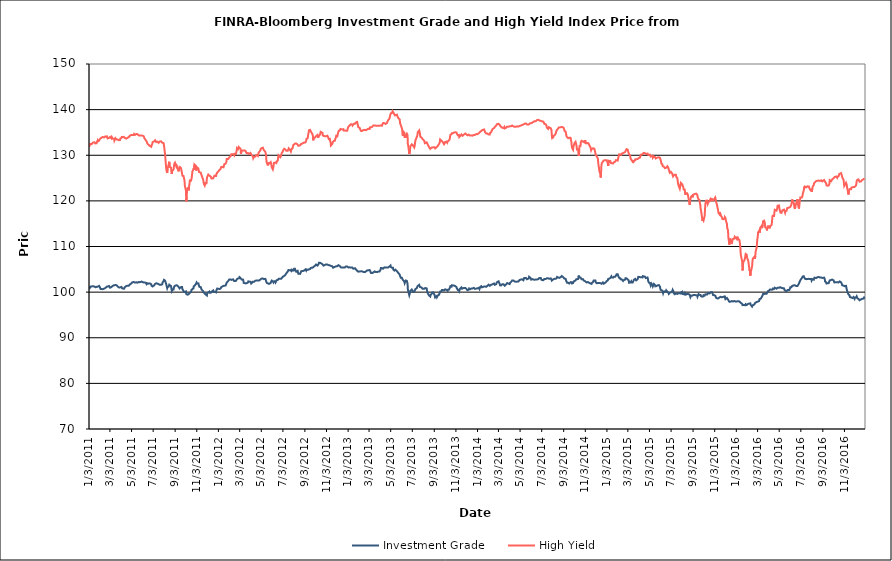
| Category | Investment Grade | High Yield |
|---|---|---|
| 1/3/11 | 101.208 | 131.858 |
| 1/4/11 | 101.316 | 132.091 |
| 1/5/11 | 100.937 | 132.302 |
| 1/6/11 | 100.955 | 132.482 |
| 1/7/11 | 101.214 | 132.404 |
| 1/10/11 | 101.247 | 132.434 |
| 1/11/11 | 101.24 | 132.58 |
| 1/12/11 | 101.18 | 132.636 |
| 1/13/11 | 101.307 | 132.753 |
| 1/14/11 | 101.392 | 132.788 |
| 1/18/11 | 101.21 | 132.849 |
| 1/19/11 | 101.349 | 132.835 |
| 1/20/11 | 101.094 | 132.594 |
| 1/21/11 | 101.074 | 132.574 |
| 1/24/11 | 101.163 | 132.632 |
| 1/25/11 | 101.328 | 132.944 |
| 1/26/11 | 101.147 | 133.021 |
| 1/27/11 | 101.186 | 133.283 |
| 1/28/11 | 101.332 | 133.054 |
| 1/31/11 | 101.371 | 133.197 |
| 2/1/11 | 101.177 | 133.376 |
| 2/2/11 | 101.113 | 133.508 |
| 2/3/11 | 100.901 | 133.416 |
| 2/4/11 | 100.688 | 133.653 |
| 2/7/11 | 100.708 | 133.883 |
| 2/8/11 | 100.678 | 134.026 |
| 2/9/11 | 100.64 | 134.065 |
| 2/10/11 | 100.635 | 134.006 |
| 2/11/11 | 100.689 | 133.906 |
| 2/14/11 | 100.76 | 133.89 |
| 2/15/11 | 100.792 | 133.913 |
| 2/16/11 | 100.816 | 134.016 |
| 2/17/11 | 100.877 | 134.107 |
| 2/18/11 | 100.849 | 134.178 |
| 2/22/11 | 101.209 | 134.145 |
| 2/23/11 | 101.204 | 133.96 |
| 2/24/11 | 101.068 | 133.689 |
| 2/25/11 | 101.217 | 133.737 |
| 2/28/11 | 101.347 | 133.797 |
| 3/1/11 | 101.398 | 133.935 |
| 3/2/11 | 101.379 | 133.992 |
| 3/3/11 | 100.969 | 134.003 |
| 3/4/11 | 101.076 | 133.893 |
| 3/7/11 | 101.137 | 133.668 |
| 3/8/11 | 101.019 | 133.964 |
| 3/9/11 | 101.172 | 133.956 |
| 3/10/11 | 101.344 | 133.656 |
| 3/11/11 | 101.44 | 133.576 |
| 3/14/11 | 101.514 | 133.638 |
| 3/15/11 | 101.535 | 133.214 |
| 3/16/11 | 101.719 | 133.178 |
| 3/17/11 | 101.535 | 133.421 |
| 3/18/11 | 101.606 | 133.749 |
| 3/21/11 | 101.533 | 133.484 |
| 3/22/11 | 101.512 | 133.544 |
| 3/23/11 | 101.421 | 133.408 |
| 3/24/11 | 101.267 | 133.44 |
| 3/25/11 | 101.138 | 133.353 |
| 3/28/11 | 101.016 | 133.284 |
| 3/29/11 | 100.882 | 133.292 |
| 3/30/11 | 100.871 | 133.463 |
| 3/31/11 | 101.038 | 133.352 |
| 4/1/11 | 100.887 | 133.702 |
| 4/4/11 | 101.136 | 133.797 |
| 4/5/11 | 100.963 | 134.02 |
| 4/6/11 | 100.836 | 133.92 |
| 4/7/11 | 100.781 | 133.902 |
| 4/8/11 | 100.76 | 134.004 |
| 4/11/11 | 100.727 | 134.028 |
| 4/12/11 | 100.924 | 133.848 |
| 4/13/11 | 101.032 | 133.808 |
| 4/14/11 | 101.001 | 133.714 |
| 4/15/11 | 101.239 | 133.871 |
| 4/18/11 | 101.36 | 133.65 |
| 4/19/11 | 101.451 | 133.651 |
| 4/20/11 | 101.424 | 133.737 |
| 4/21/11 | 101.387 | 133.825 |
| 4/25/11 | 101.419 | 133.988 |
| 4/26/11 | 101.611 | 134.092 |
| 4/27/11 | 101.48 | 134.04 |
| 4/28/11 | 101.708 | 134.311 |
| 4/29/11 | 101.828 | 134.333 |
| 5/2/11 | 101.906 | 134.443 |
| 5/3/11 | 101.997 | 134.32 |
| 5/4/11 | 102.075 | 134.479 |
| 5/5/11 | 102.171 | 134.418 |
| 5/6/11 | 102.158 | 134.578 |
| 5/9/11 | 102.209 | 134.425 |
| 5/10/11 | 102.082 | 134.688 |
| 5/11/11 | 102.109 | 134.7 |
| 5/12/11 | 102.099 | 134.527 |
| 5/13/11 | 102.138 | 134.491 |
| 5/16/11 | 102.149 | 134.632 |
| 5/17/11 | 102.353 | 134.587 |
| 5/18/11 | 102.212 | 134.566 |
| 5/19/11 | 102.07 | 134.636 |
| 5/20/11 | 102.132 | 134.542 |
| 5/23/11 | 102.226 | 134.352 |
| 5/24/11 | 102.138 | 134.411 |
| 5/25/11 | 102.088 | 134.326 |
| 5/26/11 | 102.164 | 134.342 |
| 5/27/11 | 102.195 | 134.51 |
| 5/31/11 | 102.313 | 134.338 |
| 6/1/11 | 102.499 | 134.385 |
| 6/2/11 | 102.253 | 134.221 |
| 6/3/11 | 102.189 | 134.283 |
| 6/6/11 | 102.12 | 134.159 |
| 6/7/11 | 102.072 | 133.967 |
| 6/8/11 | 102.173 | 133.704 |
| 6/9/11 | 102.106 | 133.568 |
| 6/10/11 | 102.076 | 133.506 |
| 6/13/11 | 102.012 | 133.153 |
| 6/14/11 | 101.73 | 133.037 |
| 6/15/11 | 101.868 | 132.872 |
| 6/16/11 | 101.948 | 132.554 |
| 6/17/11 | 101.926 | 132.653 |
| 6/20/11 | 101.853 | 132.269 |
| 6/21/11 | 101.876 | 132.267 |
| 6/22/11 | 101.873 | 132.44 |
| 6/23/11 | 101.908 | 132.05 |
| 6/24/11 | 102.002 | 132.113 |
| 6/27/11 | 101.741 | 131.865 |
| 6/28/11 | 101.402 | 132.191 |
| 6/29/11 | 101.26 | 132.363 |
| 6/30/11 | 101.2 | 132.454 |
| 7/1/11 | 101.237 | 132.902 |
| 7/5/11 | 101.449 | 133.029 |
| 7/6/11 | 101.506 | 133.115 |
| 7/7/11 | 101.395 | 133.231 |
| 7/8/11 | 101.8 | 133.28 |
| 7/11/11 | 101.933 | 132.888 |
| 7/12/11 | 102.014 | 132.784 |
| 7/13/11 | 102.042 | 132.957 |
| 7/14/11 | 101.89 | 132.999 |
| 7/15/11 | 101.851 | 132.866 |
| 7/18/11 | 101.732 | 132.724 |
| 7/19/11 | 101.677 | 132.722 |
| 7/20/11 | 101.802 | 132.936 |
| 7/21/11 | 101.598 | 133.028 |
| 7/22/11 | 101.707 | 133.068 |
| 7/25/11 | 101.6 | 133.049 |
| 7/26/11 | 101.668 | 133.246 |
| 7/27/11 | 101.671 | 132.951 |
| 7/28/11 | 101.71 | 132.748 |
| 7/29/11 | 102.101 | 132.541 |
| 8/1/11 | 102.445 | 132.668 |
| 8/2/11 | 102.69 | 132.126 |
| 8/3/11 | 102.765 | 131.582 |
| 8/4/11 | 102.858 | 130.856 |
| 8/5/11 | 102.526 | 130.297 |
| 8/8/11 | 101.818 | 127.319 |
| 8/9/11 | 101.642 | 126.715 |
| 8/10/11 | 101.666 | 126.678 |
| 8/11/11 | 100.881 | 126.106 |
| 8/12/11 | 101.126 | 127.015 |
| 8/15/11 | 101.191 | 127.903 |
| 8/16/11 | 101.405 | 128.042 |
| 8/17/11 | 101.631 | 128.573 |
| 8/18/11 | 101.692 | 127.705 |
| 8/19/11 | 101.529 | 127.395 |
| 8/22/11 | 101.314 | 127.264 |
| 8/23/11 | 100.821 | 126.282 |
| 8/24/11 | 100.273 | 125.927 |
| 8/25/11 | 100.448 | 126.498 |
| 8/26/11 | 100.592 | 126.715 |
| 8/29/11 | 100.573 | 126.885 |
| 8/30/11 | 101.003 | 127.033 |
| 8/31/11 | 101.14 | 128.078 |
| 9/1/11 | 101.324 | 128.205 |
| 9/2/11 | 101.474 | 128.365 |
| 9/6/11 | 101.516 | 127.515 |
| 9/7/11 | 101.486 | 127.765 |
| 9/8/11 | 101.502 | 127.727 |
| 9/9/11 | 101.426 | 127.519 |
| 9/12/11 | 101.178 | 126.474 |
| 9/13/11 | 100.959 | 126.623 |
| 9/14/11 | 100.983 | 127.097 |
| 9/15/11 | 100.799 | 127.314 |
| 9/16/11 | 100.88 | 127.409 |
| 9/19/11 | 101.097 | 127.172 |
| 9/20/11 | 101.095 | 127.29 |
| 9/21/11 | 101.153 | 127.116 |
| 9/22/11 | 101.108 | 125.995 |
| 9/23/11 | 100.647 | 125.52 |
| 9/26/11 | 100.298 | 125.465 |
| 9/27/11 | 100.058 | 125.611 |
| 9/28/11 | 99.924 | 124.851 |
| 9/29/11 | 99.972 | 124.344 |
| 9/30/11 | 99.996 | 123.273 |
| 10/3/11 | 100.148 | 122.236 |
| 10/4/11 | 99.594 | 119.881 |
| 10/5/11 | 99.418 | 120.775 |
| 10/6/11 | 99.443 | 122.277 |
| 10/7/11 | 99.434 | 122.768 |
| 10/10/11 | 99.517 | 122.852 |
| 10/11/11 | 99.353 | 122.3 |
| 10/12/11 | 99.527 | 123.376 |
| 10/13/11 | 99.78 | 123.672 |
| 10/14/11 | 99.81 | 124.466 |
| 10/17/11 | 100.031 | 124.417 |
| 10/18/11 | 100.25 | 124.296 |
| 10/19/11 | 100.53 | 124.939 |
| 10/20/11 | 100.68 | 125.541 |
| 10/21/11 | 100.707 | 126.394 |
| 10/24/11 | 100.807 | 126.914 |
| 10/25/11 | 101.264 | 127.167 |
| 10/26/11 | 101.368 | 126.792 |
| 10/27/11 | 101.348 | 127.975 |
| 10/28/11 | 101.463 | 127.875 |
| 10/31/11 | 101.784 | 127.696 |
| 11/1/11 | 101.959 | 126.648 |
| 11/2/11 | 102.125 | 126.978 |
| 11/3/11 | 102.008 | 127.376 |
| 11/4/11 | 101.874 | 127.162 |
| 11/7/11 | 101.905 | 127.097 |
| 11/8/11 | 101.595 | 127.239 |
| 11/9/11 | 101.39 | 126.322 |
| 11/10/11 | 101.173 | 126.414 |
| 11/11/11 | 101.238 | 126.491 |
| 11/14/11 | 101.069 | 126.17 |
| 11/15/11 | 100.767 | 125.82 |
| 11/16/11 | 100.761 | 125.629 |
| 11/17/11 | 100.469 | 125.434 |
| 11/18/11 | 100.413 | 125.196 |
| 11/21/11 | 100.183 | 124.532 |
| 11/22/11 | 99.951 | 123.879 |
| 11/23/11 | 99.805 | 123.809 |
| 11/25/11 | 99.664 | 123.358 |
| 11/28/11 | 99.47 | 124.094 |
| 11/29/11 | 99.414 | 123.689 |
| 11/30/11 | 99.404 | 124.084 |
| 12/1/11 | 99.27 | 124.86 |
| 12/2/11 | 99.785 | 125.29 |
| 12/5/11 | 99.93 | 125.775 |
| 12/6/11 | 99.982 | 125.795 |
| 12/7/11 | 99.949 | 125.612 |
| 12/8/11 | 100.115 | 125.538 |
| 12/9/11 | 99.872 | 125.454 |
| 12/12/11 | 99.867 | 125.317 |
| 12/13/11 | 99.906 | 125.158 |
| 12/14/11 | 100 | 124.913 |
| 12/15/11 | 100.134 | 124.961 |
| 12/16/11 | 100.313 | 125.058 |
| 12/19/11 | 100.375 | 124.938 |
| 12/20/11 | 100.196 | 125.175 |
| 12/21/11 | 100.097 | 125.223 |
| 12/22/11 | 100.134 | 125.503 |
| 12/23/11 | 100.016 | 125.63 |
| 12/27/11 | 99.947 | 125.464 |
| 12/28/11 | 100.421 | 125.864 |
| 12/29/11 | 100.555 | 126.044 |
| 12/30/11 | 100.774 | 126.162 |
| 1/3/12 | 100.742 | 126.521 |
| 1/4/12 | 100.597 | 126.529 |
| 1/5/12 | 100.548 | 126.663 |
| 1/6/12 | 100.672 | 126.824 |
| 1/9/12 | 100.818 | 127.016 |
| 1/10/12 | 100.91 | 127.393 |
| 1/11/12 | 101.119 | 127.414 |
| 1/12/12 | 101.246 | 127.571 |
| 1/13/12 | 101.324 | 127.463 |
| 1/17/12 | 101.365 | 127.36 |
| 1/18/12 | 101.455 | 127.435 |
| 1/19/12 | 101.448 | 128.026 |
| 1/20/12 | 101.421 | 128.07 |
| 1/23/12 | 101.433 | 128.175 |
| 1/24/12 | 101.349 | 128.221 |
| 1/25/12 | 101.65 | 128.487 |
| 1/26/12 | 102.102 | 129.167 |
| 1/27/12 | 102.266 | 129.213 |
| 1/30/12 | 102.431 | 129.164 |
| 1/31/12 | 102.58 | 129.039 |
| 2/1/12 | 102.574 | 129.405 |
| 2/2/12 | 102.767 | 129.511 |
| 2/3/12 | 102.65 | 129.574 |
| 2/6/12 | 102.774 | 129.798 |
| 2/7/12 | 102.668 | 129.809 |
| 2/8/12 | 102.826 | 130.217 |
| 2/9/12 | 102.679 | 130.377 |
| 2/10/12 | 102.743 | 130.002 |
| 2/13/12 | 102.811 | 130.239 |
| 2/14/12 | 102.821 | 130.083 |
| 2/15/12 | 102.83 | 130.106 |
| 2/16/12 | 102.429 | 129.967 |
| 2/17/12 | 102.479 | 130.307 |
| 2/21/12 | 102.463 | 130.284 |
| 2/22/12 | 102.57 | 130.67 |
| 2/23/12 | 102.664 | 130.956 |
| 2/24/12 | 102.855 | 131.597 |
| 2/27/12 | 103.004 | 131.368 |
| 2/28/12 | 103.144 | 131.529 |
| 2/29/12 | 103.205 | 131.808 |
| 3/1/12 | 103.025 | 131.852 |
| 3/2/12 | 103.284 | 131.736 |
| 3/5/12 | 103.056 | 131.389 |
| 3/6/12 | 102.929 | 130.339 |
| 3/7/12 | 102.889 | 130.576 |
| 3/8/12 | 102.775 | 130.669 |
| 3/9/12 | 102.69 | 131.049 |
| 3/12/12 | 102.756 | 131.049 |
| 3/13/12 | 102.485 | 131.146 |
| 3/14/12 | 102.022 | 131.244 |
| 3/15/12 | 101.978 | 131.069 |
| 3/16/12 | 102.017 | 131.099 |
| 3/19/12 | 101.918 | 130.958 |
| 3/20/12 | 101.786 | 130.727 |
| 3/21/12 | 102.027 | 130.902 |
| 3/22/12 | 101.958 | 130.559 |
| 3/23/12 | 102.123 | 130.411 |
| 3/26/12 | 102.121 | 130.481 |
| 3/27/12 | 102.364 | 130.583 |
| 3/28/12 | 102.343 | 130.551 |
| 3/29/12 | 102.348 | 130.289 |
| 3/30/12 | 102.304 | 130.504 |
| 4/2/12 | 102.275 | 130.507 |
| 4/3/12 | 102.178 | 130.54 |
| 4/4/12 | 101.896 | 130.313 |
| 4/5/12 | 101.959 | 130.066 |
| 4/9/12 | 102.29 | 129.724 |
| 4/10/12 | 102.336 | 129.341 |
| 4/11/12 | 102.227 | 129.316 |
| 4/12/12 | 102.258 | 129.646 |
| 4/13/12 | 102.438 | 129.816 |
| 4/16/12 | 102.512 | 129.715 |
| 4/17/12 | 102.447 | 129.998 |
| 4/18/12 | 102.478 | 130.062 |
| 4/19/12 | 102.542 | 130 |
| 4/20/12 | 102.456 | 130.072 |
| 4/23/12 | 102.528 | 129.844 |
| 4/24/12 | 102.45 | 130.122 |
| 4/25/12 | 102.376 | 130.54 |
| 4/26/12 | 102.526 | 130.61 |
| 4/27/12 | 102.624 | 130.774 |
| 4/30/12 | 102.764 | 131.097 |
| 5/1/12 | 102.747 | 131.422 |
| 5/2/12 | 102.891 | 131.549 |
| 5/3/12 | 102.958 | 131.559 |
| 5/4/12 | 103.036 | 131.564 |
| 5/7/12 | 102.967 | 131.646 |
| 5/8/12 | 103.069 | 131.43 |
| 5/9/12 | 102.922 | 131.22 |
| 5/10/12 | 102.853 | 131.368 |
| 5/11/12 | 102.937 | 131.343 |
| 5/14/12 | 102.896 | 130.719 |
| 5/15/12 | 102.777 | 130.618 |
| 5/16/12 | 102.436 | 130.036 |
| 5/17/12 | 102.22 | 128.787 |
| 5/18/12 | 102.02 | 128.397 |
| 5/21/12 | 101.935 | 127.807 |
| 5/22/12 | 101.836 | 128.404 |
| 5/23/12 | 101.909 | 128.029 |
| 5/24/12 | 101.806 | 128.076 |
| 5/25/12 | 101.934 | 128.245 |
| 5/29/12 | 102 | 128.512 |
| 5/30/12 | 102.241 | 128.252 |
| 5/31/12 | 102.454 | 128.088 |
| 6/1/12 | 102.529 | 127.354 |
| 6/4/12 | 102.342 | 126.898 |
| 6/5/12 | 102.151 | 126.694 |
| 6/6/12 | 102.104 | 127.566 |
| 6/7/12 | 102.302 | 128.314 |
| 6/8/12 | 102.404 | 128.144 |
| 6/11/12 | 102.405 | 128.406 |
| 6/12/12 | 102.158 | 128.202 |
| 6/13/12 | 102.242 | 128.297 |
| 6/14/12 | 102.219 | 128.278 |
| 6/15/12 | 102.624 | 128.671 |
| 6/18/12 | 102.678 | 128.831 |
| 6/19/12 | 102.678 | 129.471 |
| 6/20/12 | 102.731 | 129.982 |
| 6/21/12 | 102.928 | 130.01 |
| 6/22/12 | 102.86 | 129.877 |
| 6/25/12 | 102.926 | 129.569 |
| 6/26/12 | 102.827 | 129.662 |
| 6/27/12 | 102.871 | 129.855 |
| 6/28/12 | 102.95 | 129.949 |
| 6/29/12 | 102.908 | 130.465 |
| 7/2/12 | 103.372 | 130.772 |
| 7/3/12 | 103.438 | 131.071 |
| 7/5/12 | 103.483 | 131.238 |
| 7/6/12 | 103.617 | 131.405 |
| 7/9/12 | 103.743 | 131.298 |
| 7/10/12 | 103.882 | 131.313 |
| 7/11/12 | 103.974 | 131.355 |
| 7/12/12 | 104.078 | 130.988 |
| 7/13/12 | 104.213 | 131.017 |
| 7/16/12 | 104.502 | 130.976 |
| 7/17/12 | 104.542 | 130.994 |
| 7/18/12 | 104.84 | 131.143 |
| 7/19/12 | 104.904 | 131.518 |
| 7/20/12 | 104.869 | 131.357 |
| 7/23/12 | 104.76 | 131.103 |
| 7/24/12 | 104.857 | 130.931 |
| 7/25/12 | 104.856 | 130.805 |
| 7/26/12 | 104.899 | 131.091 |
| 7/27/12 | 104.627 | 131.355 |
| 7/30/12 | 104.84 | 131.604 |
| 7/31/12 | 105.028 | 131.948 |
| 8/1/12 | 104.967 | 132.255 |
| 8/2/12 | 105.058 | 132.124 |
| 8/3/12 | 104.808 | 132.261 |
| 8/6/12 | 105.018 | 132.559 |
| 8/7/12 | 104.746 | 132.745 |
| 8/8/12 | 104.638 | 132.59 |
| 8/9/12 | 104.469 | 132.581 |
| 8/10/12 | 104.646 | 132.362 |
| 8/13/12 | 104.659 | 132.342 |
| 8/14/12 | 104.381 | 132.345 |
| 8/15/12 | 104.02 | 132.073 |
| 8/16/12 | 103.908 | 132.068 |
| 8/17/12 | 103.944 | 132.003 |
| 8/20/12 | 103.998 | 132.164 |
| 8/21/12 | 104.025 | 132.365 |
| 8/22/12 | 104.353 | 132.42 |
| 8/23/12 | 104.574 | 132.471 |
| 8/24/12 | 104.535 | 132.536 |
| 8/27/12 | 104.634 | 132.588 |
| 8/28/12 | 104.679 | 132.662 |
| 8/29/12 | 104.564 | 132.576 |
| 8/30/12 | 104.666 | 132.748 |
| 8/31/12 | 104.854 | 132.757 |
| 9/4/12 | 104.974 | 132.816 |
| 9/5/12 | 104.888 | 132.819 |
| 9/6/12 | 104.737 | 133.125 |
| 9/7/12 | 104.978 | 133.605 |
| 9/10/12 | 104.878 | 133.705 |
| 9/11/12 | 104.922 | 134.088 |
| 9/12/12 | 104.881 | 134.64 |
| 9/13/12 | 104.964 | 134.936 |
| 9/14/12 | 104.926 | 135.468 |
| 9/17/12 | 105.058 | 135.563 |
| 9/18/12 | 105.16 | 135.387 |
| 9/19/12 | 105.306 | 135.375 |
| 9/20/12 | 105.214 | 135.117 |
| 9/21/12 | 105.236 | 135.047 |
| 9/24/12 | 105.353 | 134.578 |
| 9/25/12 | 105.333 | 134.277 |
| 9/26/12 | 105.396 | 133.268 |
| 9/27/12 | 105.535 | 133.642 |
| 9/28/12 | 105.652 | 133.797 |
| 10/1/12 | 105.785 | 133.896 |
| 10/2/12 | 105.876 | 133.835 |
| 10/3/12 | 105.971 | 133.992 |
| 10/4/12 | 106.042 | 134.162 |
| 10/5/12 | 105.919 | 134.321 |
| 10/8/12 | 105.81 | 134.45 |
| 10/9/12 | 105.946 | 134.131 |
| 10/10/12 | 105.923 | 133.801 |
| 10/11/12 | 106.139 | 134.188 |
| 10/12/12 | 106.424 | 134.299 |
| 10/15/12 | 106.445 | 134.521 |
| 10/16/12 | 106.447 | 134.767 |
| 10/17/12 | 106.444 | 135.122 |
| 10/18/12 | 106.326 | 135.204 |
| 10/19/12 | 106.271 | 135.012 |
| 10/22/12 | 106.114 | 134.922 |
| 10/23/12 | 105.996 | 134.365 |
| 10/24/12 | 105.971 | 134.527 |
| 10/25/12 | 105.806 | 134.564 |
| 10/26/12 | 105.938 | 134.21 |
| 10/29/12 | 105.958 | 134.185 |
| 10/30/12 | 105.958 | 134.185 |
| 10/31/12 | 106.102 | 134.104 |
| 11/1/12 | 106.069 | 134.15 |
| 11/2/12 | 106.005 | 134.287 |
| 11/5/12 | 106.032 | 134.281 |
| 11/6/12 | 105.82 | 134.439 |
| 11/7/12 | 105.9 | 133.937 |
| 11/8/12 | 105.923 | 133.875 |
| 11/9/12 | 105.877 | 133.542 |
| 11/12/12 | 105.86 | 133.603 |
| 11/13/12 | 105.873 | 133.044 |
| 11/14/12 | 105.848 | 132.789 |
| 11/15/12 | 105.744 | 132.136 |
| 11/16/12 | 105.693 | 131.979 |
| 11/19/12 | 105.653 | 132.5 |
| 11/20/12 | 105.532 | 132.869 |
| 11/21/12 | 105.358 | 132.945 |
| 11/23/12 | 105.388 | 133.147 |
| 11/26/12 | 105.534 | 133.19 |
| 11/27/12 | 105.586 | 133.501 |
| 11/28/12 | 105.642 | 133.554 |
| 11/29/12 | 105.643 | 133.926 |
| 11/30/12 | 105.715 | 134.285 |
| 12/3/12 | 105.696 | 134.168 |
| 12/4/12 | 105.727 | 134.386 |
| 12/5/12 | 105.874 | 134.874 |
| 12/6/12 | 105.901 | 135.085 |
| 12/7/12 | 105.741 | 135.362 |
| 12/10/12 | 105.722 | 135.452 |
| 12/11/12 | 105.635 | 135.61 |
| 12/12/12 | 105.563 | 135.761 |
| 12/13/12 | 105.422 | 135.826 |
| 12/14/12 | 105.506 | 135.725 |
| 12/17/12 | 105.385 | 135.641 |
| 12/18/12 | 105.191 | 135.742 |
| 12/19/12 | 105.36 | 135.775 |
| 12/20/12 | 105.386 | 135.706 |
| 12/21/12 | 105.493 | 135.434 |
| 12/24/12 | 105.382 | 135.434 |
| 12/26/12 | 105.438 | 135.223 |
| 12/27/12 | 105.63 | 135.36 |
| 12/28/12 | 105.717 | 135.388 |
| 12/31/12 | 105.623 | 135.388 |
| 1/2/13 | 105.494 | 136.004 |
| 1/3/13 | 105.419 | 136.223 |
| 1/4/13 | 105.349 | 136.418 |
| 1/7/13 | 105.428 | 136.539 |
| 1/8/13 | 105.485 | 136.567 |
| 1/9/13 | 105.45 | 136.666 |
| 1/10/13 | 105.382 | 136.791 |
| 1/11/13 | 105.347 | 136.887 |
| 1/14/13 | 105.372 | 136.76 |
| 1/15/13 | 105.348 | 136.538 |
| 1/16/13 | 105.332 | 136.64 |
| 1/17/13 | 105.127 | 136.744 |
| 1/18/13 | 105.195 | 136.872 |
| 1/22/13 | 105.239 | 136.901 |
| 1/23/13 | 105.259 | 137.065 |
| 1/24/13 | 105.154 | 137.18 |
| 1/25/13 | 104.918 | 137.344 |
| 1/28/13 | 104.671 | 137.292 |
| 1/29/13 | 104.628 | 136.915 |
| 1/30/13 | 104.462 | 136.633 |
| 1/31/13 | 104.489 | 136.183 |
| 2/1/13 | 104.509 | 136.3 |
| 2/4/13 | 104.516 | 135.996 |
| 2/5/13 | 104.38 | 135.778 |
| 2/6/13 | 104.452 | 135.607 |
| 2/7/13 | 104.557 | 135.447 |
| 2/8/13 | 104.482 | 135.313 |
| 2/11/13 | 104.548 | 135.322 |
| 2/12/13 | 104.435 | 135.393 |
| 2/13/13 | 104.331 | 135.446 |
| 2/14/13 | 104.432 | 135.524 |
| 2/15/13 | 104.394 | 135.504 |
| 2/19/13 | 104.387 | 135.572 |
| 2/20/13 | 104.348 | 135.627 |
| 2/21/13 | 104.499 | 135.402 |
| 2/22/13 | 104.557 | 135.485 |
| 2/25/13 | 104.756 | 135.664 |
| 2/26/13 | 104.841 | 135.55 |
| 2/27/13 | 104.778 | 135.597 |
| 2/28/13 | 104.777 | 135.799 |
| 3/1/13 | 104.858 | 135.684 |
| 3/4/13 | 104.85 | 135.753 |
| 3/5/13 | 104.754 | 136.111 |
| 3/6/13 | 104.599 | 136.122 |
| 3/7/13 | 104.412 | 136.133 |
| 3/8/13 | 104.18 | 136.117 |
| 3/11/13 | 104.184 | 136.2 |
| 3/12/13 | 104.331 | 136.304 |
| 3/13/13 | 104.278 | 136.283 |
| 3/14/13 | 104.276 | 136.504 |
| 3/15/13 | 104.401 | 136.543 |
| 3/18/13 | 104.535 | 136.549 |
| 3/19/13 | 104.67 | 136.561 |
| 3/20/13 | 104.466 | 136.574 |
| 3/21/13 | 104.428 | 136.487 |
| 3/22/13 | 104.404 | 136.502 |
| 3/25/13 | 104.386 | 136.448 |
| 3/26/13 | 104.316 | 136.408 |
| 3/27/13 | 104.488 | 136.442 |
| 3/28/13 | 104.489 | 136.483 |
| 4/1/13 | 104.516 | 136.479 |
| 4/2/13 | 104.463 | 136.55 |
| 4/3/13 | 104.642 | 136.537 |
| 4/4/13 | 104.92 | 136.53 |
| 4/5/13 | 105.293 | 136.496 |
| 4/8/13 | 105.29 | 136.464 |
| 4/9/13 | 105.304 | 136.717 |
| 4/10/13 | 105.125 | 136.822 |
| 4/11/13 | 105.12 | 137.05 |
| 4/12/13 | 105.316 | 137.192 |
| 4/15/13 | 105.424 | 137.038 |
| 4/16/13 | 105.369 | 137.111 |
| 4/17/13 | 105.389 | 136.936 |
| 4/18/13 | 105.407 | 136.862 |
| 4/19/13 | 105.346 | 136.955 |
| 4/22/13 | 105.406 | 137.056 |
| 4/23/13 | 105.46 | 137.317 |
| 4/24/13 | 105.498 | 137.459 |
| 4/25/13 | 105.38 | 137.639 |
| 4/26/13 | 105.595 | 137.856 |
| 4/29/13 | 105.615 | 138.038 |
| 4/30/13 | 105.612 | 138.388 |
| 5/1/13 | 105.781 | 138.733 |
| 5/2/13 | 105.844 | 138.955 |
| 5/3/13 | 105.494 | 139.201 |
| 5/6/13 | 105.353 | 139.261 |
| 5/7/13 | 105.329 | 139.46 |
| 5/8/13 | 105.359 | 139.652 |
| 5/9/13 | 105.342 | 139.604 |
| 5/10/13 | 104.923 | 139.359 |
| 5/13/13 | 104.727 | 138.947 |
| 5/14/13 | 104.694 | 138.789 |
| 5/15/13 | 104.673 | 138.724 |
| 5/16/13 | 104.927 | 138.831 |
| 5/17/13 | 104.738 | 138.852 |
| 5/20/13 | 104.621 | 138.896 |
| 5/21/13 | 104.661 | 138.85 |
| 5/22/13 | 104.462 | 138.759 |
| 5/23/13 | 104.301 | 138.269 |
| 5/24/13 | 104.298 | 138.075 |
| 5/28/13 | 103.825 | 137.844 |
| 5/29/13 | 103.525 | 137.043 |
| 5/30/13 | 103.475 | 136.973 |
| 5/31/13 | 103.159 | 136.601 |
| 6/3/13 | 103.169 | 135.944 |
| 6/4/13 | 102.987 | 135.582 |
| 6/5/13 | 102.781 | 134.538 |
| 6/6/13 | 102.788 | 134.224 |
| 6/7/13 | 102.678 | 135.191 |
| 6/10/13 | 102.314 | 134.939 |
| 6/11/13 | 101.98 | 133.85 |
| 6/12/13 | 102.018 | 134.087 |
| 6/13/13 | 102.11 | 133.805 |
| 6/14/13 | 102.545 | 134.401 |
| 6/17/13 | 102.474 | 134.746 |
| 6/18/13 | 102.164 | 134.589 |
| 6/19/13 | 101.914 | 134.457 |
| 6/20/13 | 100.588 | 132.485 |
| 6/21/13 | 100.219 | 132.116 |
| 6/24/13 | 99.311 | 130.267 |
| 6/25/13 | 99.469 | 130.422 |
| 6/26/13 | 99.857 | 131.058 |
| 6/27/13 | 100.266 | 131.995 |
| 6/28/13 | 100.357 | 132.199 |
| 7/1/13 | 100.575 | 132.38 |
| 7/2/13 | 100.774 | 132.5 |
| 7/3/13 | 100.789 | 132.233 |
| 7/5/13 | 100.052 | 132.062 |
| 7/8/13 | 100.063 | 131.702 |
| 7/9/13 | 100.261 | 131.99 |
| 7/10/13 | 100.23 | 132.194 |
| 7/11/13 | 100.65 | 133.132 |
| 7/12/13 | 100.778 | 133.422 |
| 7/15/13 | 100.866 | 133.956 |
| 7/16/13 | 101.036 | 134.184 |
| 7/17/13 | 101.286 | 134.476 |
| 7/18/13 | 101.274 | 135.077 |
| 7/19/13 | 101.435 | 135.209 |
| 7/22/13 | 101.6 | 135.45 |
| 7/23/13 | 101.546 | 135.437 |
| 7/24/13 | 101.125 | 134.763 |
| 7/25/13 | 100.927 | 134.065 |
| 7/26/13 | 101.109 | 134.013 |
| 7/29/13 | 101.003 | 133.854 |
| 7/30/13 | 100.974 | 133.888 |
| 7/31/13 | 100.761 | 133.596 |
| 8/1/13 | 100.577 | 133.583 |
| 8/2/13 | 100.839 | 133.403 |
| 8/5/13 | 100.724 | 133.206 |
| 8/6/13 | 100.666 | 132.905 |
| 8/7/13 | 100.771 | 132.644 |
| 8/8/13 | 100.906 | 132.743 |
| 8/9/13 | 100.882 | 132.811 |
| 8/12/13 | 100.814 | 132.845 |
| 8/13/13 | 100.327 | 132.628 |
| 8/14/13 | 100.232 | 132.676 |
| 8/15/13 | 99.756 | 132.339 |
| 8/16/13 | 99.565 | 132.204 |
| 8/19/13 | 99.254 | 131.767 |
| 8/20/13 | 99.406 | 131.634 |
| 8/21/13 | 99.234 | 131.571 |
| 8/22/13 | 99.051 | 131.404 |
| 8/23/13 | 99.367 | 131.617 |
| 8/26/13 | 99.636 | 131.681 |
| 8/27/13 | 99.89 | 131.589 |
| 8/28/13 | 99.751 | 131.599 |
| 8/29/13 | 99.819 | 131.721 |
| 8/30/13 | 99.969 | 131.931 |
| 9/3/13 | 99.443 | 131.767 |
| 9/4/13 | 99.4 | 131.735 |
| 9/5/13 | 98.833 | 131.503 |
| 9/6/13 | 99.036 | 131.534 |
| 9/9/13 | 99.126 | 131.762 |
| 9/10/13 | 98.881 | 131.688 |
| 9/11/13 | 98.985 | 131.774 |
| 9/12/13 | 99.199 | 132.012 |
| 9/13/13 | 99.132 | 132.108 |
| 9/16/13 | 99.445 | 132.49 |
| 9/17/13 | 99.387 | 132.526 |
| 9/18/13 | 99.587 | 132.801 |
| 9/19/13 | 100.13 | 133.454 |
| 9/20/13 | 100.145 | 133.463 |
| 9/23/13 | 100.222 | 133.158 |
| 9/24/13 | 100.458 | 133.178 |
| 9/25/13 | 100.57 | 133.037 |
| 9/26/13 | 100.459 | 132.947 |
| 9/27/13 | 100.477 | 132.761 |
| 9/30/13 | 100.36 | 132.403 |
| 10/1/13 | 100.351 | 132.559 |
| 10/2/13 | 100.5 | 132.65 |
| 10/3/13 | 100.614 | 132.895 |
| 10/4/13 | 100.436 | 132.974 |
| 10/7/13 | 100.499 | 133.004 |
| 10/8/13 | 100.458 | 132.84 |
| 10/9/13 | 100.359 | 132.765 |
| 10/10/13 | 100.309 | 133.012 |
| 10/11/13 | 100.536 | 133.183 |
| 10/14/13 | 100.578 | 133.263 |
| 10/15/13 | 100.404 | 133.285 |
| 10/16/13 | 100.541 | 133.539 |
| 10/17/13 | 101.066 | 134.085 |
| 10/18/13 | 101.3 | 134.484 |
| 10/21/13 | 101.202 | 134.622 |
| 10/22/13 | 101.507 | 134.843 |
| 10/23/13 | 101.575 | 134.752 |
| 10/24/13 | 101.454 | 134.8 |
| 10/25/13 | 101.475 | 134.836 |
| 10/28/13 | 101.432 | 134.984 |
| 10/29/13 | 101.425 | 134.988 |
| 10/30/13 | 101.524 | 135.037 |
| 10/31/13 | 101.352 | 135.022 |
| 11/1/13 | 101.143 | 134.905 |
| 11/4/13 | 101.125 | 135.008 |
| 11/5/13 | 100.846 | 134.753 |
| 11/6/13 | 100.906 | 134.761 |
| 11/7/13 | 100.99 | 134.746 |
| 11/8/13 | 100.473 | 134.373 |
| 11/11/13 | 100.506 | 134.437 |
| 11/12/13 | 100.257 | 134.002 |
| 11/13/13 | 100.423 | 133.829 |
| 11/14/13 | 100.717 | 134.11 |
| 11/15/13 | 100.772 | 134.271 |
| 11/18/13 | 101.031 | 134.561 |
| 11/19/13 | 100.928 | 134.495 |
| 11/20/13 | 100.749 | 134.418 |
| 11/21/13 | 100.578 | 134.251 |
| 11/22/13 | 100.784 | 134.462 |
| 11/25/13 | 100.926 | 134.532 |
| 11/26/13 | 101.066 | 134.489 |
| 11/27/13 | 100.968 | 134.694 |
| 11/29/13 | 100.926 | 134.769 |
| 12/2/13 | 100.715 | 134.59 |
| 12/3/13 | 100.783 | 134.592 |
| 12/4/13 | 100.522 | 134.448 |
| 12/5/13 | 100.422 | 134.378 |
| 12/6/13 | 100.434 | 134.486 |
| 12/9/13 | 100.55 | 134.531 |
| 12/10/13 | 100.804 | 134.606 |
| 12/11/13 | 100.783 | 134.549 |
| 12/12/13 | 100.616 | 134.316 |
| 12/13/13 | 100.656 | 134.34 |
| 12/16/13 | 100.77 | 134.355 |
| 12/17/13 | 100.883 | 134.318 |
| 12/18/13 | 100.862 | 134.256 |
| 12/19/13 | 100.784 | 134.28 |
| 12/20/13 | 100.91 | 134.382 |
| 12/23/13 | 100.94 | 134.459 |
| 12/24/13 | 100.826 | 134.433 |
| 12/26/13 | 100.715 | 134.462 |
| 12/27/13 | 100.661 | 134.544 |
| 12/30/13 | 100.78 | 134.644 |
| 12/31/13 | 100.835 | 134.665 |
| 1/2/14 | 100.818 | 134.61 |
| 1/3/14 | 100.821 | 134.675 |
| 1/6/14 | 100.947 | 134.841 |
| 1/7/14 | 100.979 | 135.053 |
| 1/8/14 | 100.662 | 135.04 |
| 1/9/14 | 100.703 | 135.072 |
| 1/10/14 | 101.104 | 135.228 |
| 1/13/14 | 101.302 | 135.332 |
| 1/14/14 | 101.168 | 135.33 |
| 1/15/14 | 101.05 | 135.493 |
| 1/16/14 | 101.186 | 135.513 |
| 1/17/14 | 101.214 | 135.694 |
| 1/21/14 | 101.237 | 135.657 |
| 1/22/14 | 101.077 | 135.696 |
| 1/23/14 | 101.165 | 135.526 |
| 1/24/14 | 101.225 | 135.025 |
| 1/27/14 | 101.165 | 134.766 |
| 1/28/14 | 101.185 | 134.798 |
| 1/29/14 | 101.336 | 134.736 |
| 1/30/14 | 101.366 | 134.782 |
| 1/31/14 | 101.431 | 134.664 |
| 2/3/14 | 101.636 | 134.541 |
| 2/4/14 | 101.583 | 134.457 |
| 2/5/14 | 101.42 | 134.361 |
| 2/6/14 | 101.393 | 134.536 |
| 2/7/14 | 101.592 | 134.888 |
| 2/10/14 | 101.615 | 135.076 |
| 2/11/14 | 101.498 | 135.216 |
| 2/12/14 | 101.418 | 135.441 |
| 2/13/14 | 101.69 | 135.543 |
| 2/14/14 | 101.753 | 135.746 |
| 2/18/14 | 101.892 | 135.952 |
| 2/19/14 | 101.879 | 136.044 |
| 2/20/14 | 101.613 | 136.097 |
| 2/21/14 | 101.699 | 136.258 |
| 2/24/14 | 101.732 | 136.482 |
| 2/25/14 | 101.989 | 136.691 |
| 2/26/14 | 102.079 | 136.809 |
| 2/27/14 | 102.222 | 136.918 |
| 2/28/14 | 102.211 | 137.009 |
| 3/3/14 | 102.364 | 136.884 |
| 3/4/14 | 102.118 | 136.915 |
| 3/5/14 | 102.048 | 136.916 |
| 3/6/14 | 101.816 | 136.684 |
| 3/7/14 | 101.497 | 136.459 |
| 3/10/14 | 101.461 | 136.253 |
| 3/11/14 | 101.46 | 136.252 |
| 3/12/14 | 101.557 | 136.142 |
| 3/13/14 | 101.718 | 136.026 |
| 3/14/14 | 101.769 | 135.809 |
| 3/17/14 | 101.717 | 135.965 |
| 3/18/14 | 101.749 | 136.072 |
| 3/19/14 | 101.649 | 136.191 |
| 3/20/14 | 101.412 | 135.875 |
| 3/21/14 | 101.566 | 136.086 |
| 3/24/14 | 101.667 | 136.015 |
| 3/25/14 | 101.737 | 136.04 |
| 3/26/14 | 101.878 | 136.252 |
| 3/27/14 | 101.987 | 136.119 |
| 3/28/14 | 101.878 | 136.233 |
| 3/31/14 | 101.852 | 136.266 |
| 4/1/14 | 101.868 | 136.261 |
| 4/2/14 | 101.643 | 136.321 |
| 4/3/14 | 101.764 | 136.337 |
| 4/4/14 | 102.025 | 136.448 |
| 4/7/14 | 102.21 | 136.349 |
| 4/8/14 | 102.242 | 136.393 |
| 4/9/14 | 102.266 | 136.486 |
| 4/10/14 | 102.532 | 136.521 |
| 4/11/14 | 102.573 | 136.311 |
| 4/14/14 | 102.531 | 136.308 |
| 4/15/14 | 102.544 | 136.227 |
| 4/16/14 | 102.487 | 136.253 |
| 4/17/14 | 102.346 | 136.257 |
| 4/21/14 | 102.277 | 136.247 |
| 4/22/14 | 102.207 | 136.279 |
| 4/23/14 | 102.343 | 136.332 |
| 4/24/14 | 102.303 | 136.334 |
| 4/25/14 | 102.421 | 136.355 |
| 4/28/14 | 102.328 | 136.308 |
| 4/29/14 | 102.243 | 136.341 |
| 4/30/14 | 102.413 | 136.464 |
| 5/1/14 | 102.654 | 136.42 |
| 5/2/14 | 102.735 | 136.585 |
| 5/5/14 | 102.752 | 136.518 |
| 5/6/14 | 102.75 | 136.554 |
| 5/7/14 | 102.757 | 136.59 |
| 5/8/14 | 102.825 | 136.629 |
| 5/9/14 | 102.765 | 136.738 |
| 5/12/14 | 102.608 | 136.757 |
| 5/13/14 | 102.76 | 136.86 |
| 5/14/14 | 103.095 | 136.951 |
| 5/15/14 | 103.233 | 136.892 |
| 5/16/14 | 103.154 | 136.848 |
| 5/19/14 | 103.118 | 136.968 |
| 5/20/14 | 103.068 | 136.874 |
| 5/21/14 | 102.909 | 136.849 |
| 5/22/14 | 102.817 | 136.739 |
| 5/23/14 | 102.956 | 136.771 |
| 5/27/14 | 102.996 | 136.726 |
| 5/28/14 | 103.368 | 136.78 |
| 5/29/14 | 103.4 | 136.844 |
| 5/30/14 | 103.25 | 136.989 |
| 6/2/14 | 102.997 | 137.03 |
| 6/3/14 | 102.747 | 136.843 |
| 6/4/14 | 102.639 | 136.861 |
| 6/5/14 | 102.724 | 137.095 |
| 6/6/14 | 102.858 | 137.239 |
| 6/9/14 | 102.774 | 137.321 |
| 6/10/14 | 102.652 | 137.409 |
| 6/11/14 | 102.666 | 137.46 |
| 6/12/14 | 102.706 | 137.448 |
| 6/13/14 | 102.744 | 137.427 |
| 6/16/14 | 102.763 | 137.473 |
| 6/17/14 | 102.566 | 137.403 |
| 6/18/14 | 102.647 | 137.424 |
| 6/19/14 | 102.775 | 137.698 |
| 6/20/14 | 102.697 | 137.723 |
| 6/23/14 | 102.846 | 137.779 |
| 6/24/14 | 102.88 | 137.797 |
| 6/25/14 | 103.059 | 137.699 |
| 6/26/14 | 103.117 | 137.613 |
| 6/27/14 | 103.111 | 137.582 |
| 6/30/14 | 103.096 | 137.543 |
| 7/1/14 | 102.92 | 137.521 |
| 7/2/14 | 102.692 | 137.487 |
| 7/3/14 | 102.53 | 137.445 |
| 7/7/14 | 102.607 | 137.369 |
| 7/8/14 | 102.82 | 137.259 |
| 7/9/14 | 102.778 | 137.102 |
| 7/10/14 | 102.892 | 136.873 |
| 7/11/14 | 102.97 | 136.858 |
| 7/14/14 | 102.883 | 136.783 |
| 7/15/14 | 102.808 | 136.662 |
| 7/16/14 | 102.837 | 136.489 |
| 7/17/14 | 103.023 | 136.093 |
| 7/18/14 | 102.976 | 135.884 |
| 7/21/14 | 103.018 | 135.786 |
| 7/22/14 | 103.027 | 135.911 |
| 7/23/14 | 103.133 | 136.146 |
| 7/24/14 | 102.926 | 136.135 |
| 7/25/14 | 103.053 | 136.103 |
| 7/28/14 | 103.005 | 135.916 |
| 7/29/14 | 103.084 | 135.842 |
| 7/30/14 | 102.775 | 135.555 |
| 7/31/14 | 102.536 | 134.442 |
| 8/1/14 | 102.65 | 133.751 |
| 8/4/14 | 102.794 | 133.906 |
| 8/5/14 | 102.693 | 134.262 |
| 8/6/14 | 102.743 | 134.202 |
| 8/7/14 | 102.903 | 134.308 |
| 8/8/14 | 103.015 | 134.39 |
| 8/11/14 | 102.911 | 134.76 |
| 8/12/14 | 102.848 | 134.962 |
| 8/13/14 | 102.947 | 135.352 |
| 8/14/14 | 103.093 | 135.465 |
| 8/15/14 | 103.336 | 135.579 |
| 8/18/14 | 103.224 | 135.868 |
| 8/19/14 | 103.166 | 136.06 |
| 8/20/14 | 103.049 | 136.102 |
| 8/21/14 | 103.116 | 136.129 |
| 8/22/14 | 103.16 | 136.109 |
| 8/25/14 | 103.266 | 136.118 |
| 8/26/14 | 103.305 | 136.212 |
| 8/27/14 | 103.386 | 136.164 |
| 8/28/14 | 103.533 | 136.214 |
| 8/29/14 | 103.569 | 136.23 |
| 9/2/14 | 103.224 | 136.057 |
| 9/3/14 | 103.152 | 135.89 |
| 9/4/14 | 102.992 | 135.641 |
| 9/5/14 | 102.979 | 135.338 |
| 9/8/14 | 102.91 | 135.188 |
| 9/9/14 | 102.636 | 134.826 |
| 9/10/14 | 102.415 | 134.318 |
| 9/11/14 | 102.404 | 134.077 |
| 9/12/14 | 102.066 | 133.947 |
| 9/15/14 | 102.058 | 133.746 |
| 9/16/14 | 102.079 | 133.58 |
| 9/17/14 | 102.06 | 133.729 |
| 9/18/14 | 101.895 | 133.842 |
| 9/19/14 | 102.051 | 133.984 |
| 9/22/14 | 102.194 | 133.817 |
| 9/23/14 | 102.265 | 133.321 |
| 9/24/14 | 102.135 | 133.064 |
| 9/25/14 | 102.162 | 132.238 |
| 9/26/14 | 101.911 | 131.656 |
| 9/29/14 | 101.987 | 131.223 |
| 9/30/14 | 101.995 | 131.89 |
| 10/1/14 | 102.349 | 132.149 |
| 10/2/14 | 102.373 | 132.201 |
| 10/3/14 | 102.345 | 132.64 |
| 10/6/14 | 102.56 | 132.946 |
| 10/7/14 | 102.76 | 132.603 |
| 10/8/14 | 102.816 | 132.383 |
| 10/9/14 | 102.873 | 131.878 |
| 10/10/14 | 102.843 | 131.266 |
| 10/13/14 | 102.861 | 131.314 |
| 10/14/14 | 103.153 | 130.54 |
| 10/15/14 | 103.63 | 129.86 |
| 10/16/14 | 103.21 | 130.301 |
| 10/17/14 | 103.149 | 132.001 |
| 10/20/14 | 103.206 | 132.057 |
| 10/21/14 | 103.156 | 132.922 |
| 10/22/14 | 103.063 | 133.044 |
| 10/23/14 | 102.823 | 133.165 |
| 10/24/14 | 102.843 | 133.183 |
| 10/27/14 | 102.852 | 132.995 |
| 10/28/14 | 102.764 | 133.102 |
| 10/29/14 | 102.545 | 132.948 |
| 10/30/14 | 102.596 | 132.859 |
| 10/31/14 | 102.445 | 133.107 |
| 11/3/14 | 102.344 | 133.133 |
| 11/4/14 | 102.35 | 132.642 |
| 11/5/14 | 102.221 | 132.701 |
| 11/6/14 | 102.127 | 132.705 |
| 11/7/14 | 102.255 | 132.638 |
| 11/10/14 | 102.218 | 132.691 |
| 11/11/14 | 102.225 | 132.81 |
| 11/12/14 | 102.112 | 132.619 |
| 11/13/14 | 102.052 | 132.412 |
| 11/14/14 | 102.008 | 132.145 |
| 11/17/14 | 101.894 | 131.772 |
| 11/18/14 | 101.843 | 131.427 |
| 11/19/14 | 101.695 | 131.083 |
| 11/20/14 | 101.809 | 131.09 |
| 11/21/14 | 102.03 | 131.414 |
| 11/24/14 | 102.171 | 131.531 |
| 11/25/14 | 102.338 | 131.588 |
| 11/26/14 | 102.539 | 131.644 |
| 11/28/14 | 102.655 | 131.425 |
| 12/1/14 | 102.559 | 130.466 |
| 12/2/14 | 102.141 | 129.983 |
| 12/3/14 | 102.081 | 130.038 |
| 12/4/14 | 102.177 | 129.993 |
| 12/5/14 | 101.947 | 129.782 |
| 12/8/14 | 101.994 | 129.233 |
| 12/9/14 | 102.101 | 128.353 |
| 12/10/14 | 102.099 | 127.663 |
| 12/11/14 | 102.021 | 127.356 |
| 12/12/14 | 102.212 | 126.57 |
| 12/15/14 | 101.978 | 125.84 |
| 12/16/14 | 101.885 | 125.12 |
| 12/17/14 | 101.994 | 126.235 |
| 12/18/14 | 101.843 | 127.8 |
| 12/19/14 | 102.027 | 128.272 |
| 12/22/14 | 102.137 | 128.584 |
| 12/23/14 | 102.011 | 128.794 |
| 12/24/14 | 101.848 | 128.833 |
| 12/26/14 | 101.905 | 128.825 |
| 12/29/14 | 102.054 | 128.921 |
| 12/30/14 | 102.239 | 128.765 |
| 12/31/14 | 102.233 | 128.769 |
| 1/2/15 | 102.426 | 128.911 |
| 1/5/15 | 102.586 | 128.223 |
| 1/6/15 | 102.878 | 127.662 |
| 1/7/15 | 102.893 | 128.095 |
| 1/8/15 | 102.797 | 128.789 |
| 1/9/15 | 102.956 | 128.868 |
| 1/12/15 | 103.094 | 128.728 |
| 1/13/15 | 103.116 | 128.583 |
| 1/14/15 | 103.282 | 128.28 |
| 1/15/15 | 103.445 | 128.444 |
| 1/16/15 | 103.218 | 128.331 |
| 1/20/15 | 103.176 | 128.203 |
| 1/21/15 | 103.074 | 128.203 |
| 1/22/15 | 102.998 | 128.455 |
| 1/23/15 | 103.395 | 128.628 |
| 1/26/15 | 103.388 | 128.595 |
| 1/27/15 | 103.486 | 128.767 |
| 1/28/15 | 103.616 | 128.923 |
| 1/29/15 | 103.575 | 128.896 |
| 1/30/15 | 103.915 | 128.884 |
| 2/2/15 | 103.902 | 128.826 |
| 2/3/15 | 103.611 | 129.307 |
| 2/4/15 | 103.464 | 129.573 |
| 2/5/15 | 103.571 | 129.826 |
| 2/6/15 | 103.134 | 130.204 |
| 2/9/15 | 103.034 | 130.169 |
| 2/10/15 | 102.809 | 130.199 |
| 2/11/15 | 102.739 | 130.053 |
| 2/12/15 | 102.846 | 130.105 |
| 2/13/15 | 102.803 | 130.334 |
| 2/17/15 | 102.437 | 130.465 |
| 2/18/15 | 102.543 | 130.673 |
| 2/19/15 | 102.623 | 130.581 |
| 2/20/15 | 102.701 | 130.602 |
| 2/23/15 | 102.76 | 130.717 |
| 2/24/15 | 103.054 | 130.904 |
| 2/25/15 | 103.205 | 131.093 |
| 2/26/15 | 103.084 | 131.259 |
| 2/27/15 | 103.014 | 131.346 |
| 3/2/15 | 102.766 | 131.232 |
| 3/3/15 | 102.641 | 131.019 |
| 3/4/15 | 102.55 | 130.662 |
| 3/5/15 | 102.571 | 130.64 |
| 3/6/15 | 102.05 | 130.229 |
| 3/9/15 | 102.107 | 129.958 |
| 3/10/15 | 102.236 | 129.348 |
| 3/11/15 | 102.218 | 129.308 |
| 3/12/15 | 102.373 | 129.437 |
| 3/13/15 | 102.12 | 128.915 |
| 3/16/15 | 102.092 | 128.692 |
| 3/17/15 | 102.088 | 128.301 |
| 3/18/15 | 102.392 | 128.399 |
| 3/19/15 | 102.637 | 128.765 |
| 3/20/15 | 102.778 | 128.818 |
| 3/23/15 | 102.9 | 128.891 |
| 3/24/15 | 103.067 | 129.136 |
| 3/25/15 | 102.948 | 129.155 |
| 3/26/15 | 102.572 | 129.012 |
| 3/27/15 | 102.722 | 129.135 |
| 3/30/15 | 102.816 | 129.18 |
| 3/31/15 | 102.97 | 129.203 |
| 4/1/15 | 103.346 | 129.242 |
| 4/2/15 | 103.283 | 129.384 |
| 4/6/15 | 103.281 | 129.514 |
| 4/7/15 | 103.339 | 129.813 |
| 4/8/15 | 103.385 | 130.12 |
| 4/9/15 | 103.25 | 130.08 |
| 4/10/15 | 103.269 | 130.183 |
| 4/13/15 | 103.225 | 130.222 |
| 4/14/15 | 103.502 | 130.217 |
| 4/15/15 | 103.476 | 130.43 |
| 4/16/15 | 103.412 | 130.52 |
| 4/17/15 | 103.448 | 130.393 |
| 4/20/15 | 103.374 | 130.451 |
| 4/21/15 | 103.344 | 130.415 |
| 4/22/15 | 103.073 | 130.258 |
| 4/23/15 | 103.075 | 130.272 |
| 4/24/15 | 103.252 | 130.37 |
| 4/27/15 | 103.2 | 130.372 |
| 4/28/15 | 102.95 | 130.305 |
| 4/29/15 | 102.411 | 130.069 |
| 4/30/15 | 102.251 | 129.999 |
| 5/1/15 | 102.081 | 130.001 |
| 5/4/15 | 101.991 | 130.107 |
| 5/5/15 | 101.745 | 130.012 |
| 5/6/15 | 101.469 | 129.725 |
| 5/7/15 | 101.552 | 129.512 |
| 5/8/15 | 101.879 | 129.87 |
| 5/11/15 | 101.525 | 129.898 |
| 5/12/15 | 101.269 | 129.438 |
| 5/13/15 | 101.316 | 129.534 |
| 5/14/15 | 101.397 | 129.569 |
| 5/15/15 | 101.81 | 129.716 |
| 5/18/15 | 101.582 | 129.614 |
| 5/19/15 | 101.262 | 129.456 |
| 5/20/15 | 101.187 | 129.294 |
| 5/21/15 | 101.333 | 129.372 |
| 5/22/15 | 101.31 | 129.503 |
| 5/26/15 | 101.519 | 129.524 |
| 5/27/15 | 101.506 | 129.504 |
| 5/28/15 | 101.507 | 129.417 |
| 5/29/15 | 101.544 | 129.539 |
| 6/1/15 | 101.222 | 129.422 |
| 6/2/15 | 100.801 | 129.253 |
| 6/3/15 | 100.493 | 128.955 |
| 6/4/15 | 100.607 | 128.669 |
| 6/5/15 | 100.338 | 128.185 |
| 6/8/15 | 100.328 | 127.981 |
| 6/9/15 | 100.063 | 127.603 |
| 6/10/15 | 99.766 | 127.441 |
| 6/11/15 | 100.019 | 127.722 |
| 6/12/15 | 100.209 | 127.509 |
| 6/15/15 | 100.183 | 127.18 |
| 6/16/15 | 100.204 | 127.036 |
| 6/17/15 | 100.102 | 127.086 |
| 6/18/15 | 100.13 | 127.235 |
| 6/19/15 | 100.39 | 127.422 |
| 6/22/15 | 100.096 | 127.586 |
| 6/23/15 | 99.909 | 127.511 |
| 6/24/15 | 99.918 | 127.359 |
| 6/25/15 | 99.854 | 127.195 |
| 6/26/15 | 99.62 | 126.893 |
| 6/29/15 | 99.884 | 126.158 |
| 6/30/15 | 100.037 | 126.2 |
| 7/1/15 | 99.808 | 126.273 |
| 7/2/15 | 99.959 | 126.354 |
| 7/6/15 | 100.232 | 125.966 |
| 7/7/15 | 100.504 | 125.596 |
| 7/8/15 | 100.46 | 125.367 |
| 7/9/15 | 100.206 | 125.508 |
| 7/10/15 | 99.759 | 125.61 |
| 7/13/15 | 99.543 | 125.751 |
| 7/14/15 | 99.576 | 125.717 |
| 7/15/15 | 99.661 | 125.833 |
| 7/16/15 | 99.721 | 125.742 |
| 7/17/15 | 99.787 | 125.286 |
| 7/20/15 | 99.6 | 124.999 |
| 7/21/15 | 99.649 | 124.522 |
| 7/22/15 | 99.72 | 123.795 |
| 7/23/15 | 99.744 | 123.523 |
| 7/24/15 | 99.803 | 123.3 |
| 7/27/15 | 99.786 | 122.67 |
| 7/28/15 | 99.739 | 122.649 |
| 7/29/15 | 99.618 | 123.461 |
| 7/30/15 | 99.685 | 123.964 |
| 7/31/15 | 99.954 | 123.922 |
| 8/3/15 | 100.094 | 123.653 |
| 8/4/15 | 99.962 | 123.719 |
| 8/5/15 | 99.584 | 123.491 |
| 8/6/15 | 99.586 | 122.954 |
| 8/7/15 | 99.668 | 122.503 |
| 8/10/15 | 99.471 | 122.46 |
| 8/11/15 | 99.769 | 121.721 |
| 8/12/15 | 99.692 | 121.342 |
| 8/13/15 | 99.468 | 121.66 |
| 8/14/15 | 99.448 | 121.642 |
| 8/17/15 | 99.602 | 121.654 |
| 8/18/15 | 99.477 | 121.633 |
| 8/19/15 | 99.424 | 121.252 |
| 8/20/15 | 99.586 | 120.824 |
| 8/21/15 | 99.626 | 120.461 |
| 8/24/15 | 99.414 | 119.113 |
| 8/25/15 | 99.195 | 119.971 |
| 8/26/15 | 98.899 | 119.946 |
| 8/27/15 | 99.074 | 120.628 |
| 8/28/15 | 99.244 | 120.939 |
| 8/31/15 | 99.217 | 121.131 |
| 9/1/15 | 99.152 | 120.781 |
| 9/2/15 | 99.203 | 120.942 |
| 9/3/15 | 99.347 | 121.372 |
| 9/4/15 | 99.526 | 121.243 |
| 9/8/15 | 99.36 | 121.524 |
| 9/9/15 | 99.315 | 121.732 |
| 9/10/15 | 99.219 | 121.563 |
| 9/11/15 | 99.299 | 121.587 |
| 9/14/15 | 99.28 | 121.4 |
| 9/15/15 | 98.987 | 121.19 |
| 9/16/15 | 98.862 | 120.73 |
| 9/17/15 | 99.061 | 120.585 |
| 9/18/15 | 99.563 | 120.333 |
| 9/21/15 | 99.399 | 120.151 |
| 9/22/15 | 99.494 | 119.36 |
| 9/23/15 | 99.371 | 119.122 |
| 9/24/15 | 99.35 | 118.157 |
| 9/25/15 | 99.1 | 117.905 |
| 9/28/15 | 99.012 | 116.226 |
| 9/29/15 | 98.984 | 115.614 |
| 9/30/15 | 99.07 | 116.002 |
| 10/1/15 | 99.06 | 115.948 |
| 10/2/15 | 99.323 | 115.684 |
| 10/5/15 | 99.23 | 116.623 |
| 10/6/15 | 99.352 | 117.736 |
| 10/7/15 | 99.51 | 119.116 |
| 10/8/15 | 99.412 | 119.115 |
| 10/9/15 | 99.403 | 120.047 |
| 10/12/15 | 99.475 | 120.06 |
| 10/13/15 | 99.568 | 119.722 |
| 10/14/15 | 99.799 | 119.376 |
| 10/15/15 | 99.747 | 119.342 |
| 10/16/15 | 99.774 | 119.841 |
| 10/19/15 | 99.716 | 119.878 |
| 10/20/15 | 99.599 | 120.046 |
| 10/21/15 | 99.843 | 120.27 |
| 10/22/15 | 99.962 | 120.041 |
| 10/23/15 | 99.839 | 120.443 |
| 10/26/15 | 99.988 | 120.39 |
| 10/27/15 | 100.024 | 120.083 |
| 10/28/15 | 99.784 | 120.133 |
| 10/29/15 | 99.366 | 120.237 |
| 10/30/15 | 99.366 | 120.195 |
| 11/2/15 | 99.31 | 120.487 |
| 11/3/15 | 99.232 | 120.637 |
| 11/4/15 | 99.181 | 120.753 |
| 11/5/15 | 99.133 | 120.502 |
| 11/6/15 | 98.802 | 119.883 |
| 11/9/15 | 98.639 | 119.13 |
| 11/10/15 | 98.69 | 118.692 |
| 11/11/15 | 98.74 | 118.736 |
| 11/12/15 | 98.611 | 118.014 |
| 11/13/15 | 98.747 | 117.394 |
| 11/16/15 | 98.823 | 117.075 |
| 11/17/15 | 98.766 | 117.548 |
| 11/18/15 | 98.769 | 117.423 |
| 11/19/15 | 98.972 | 116.89 |
| 11/20/15 | 98.935 | 116.829 |
| 11/23/15 | 98.87 | 116.393 |
| 11/24/15 | 98.906 | 116.043 |
| 11/25/15 | 98.93 | 116.051 |
| 11/27/15 | 98.976 | 115.977 |
| 11/30/15 | 98.929 | 116.132 |
| 12/1/15 | 99.197 | 116.463 |
| 12/2/15 | 99.116 | 116.678 |
| 12/3/15 | 98.476 | 116.209 |
| 12/4/15 | 98.55 | 115.723 |
| 12/7/15 | 98.714 | 114.95 |
| 12/8/15 | 98.535 | 113.929 |
| 12/9/15 | 98.493 | 113.937 |
| 12/10/15 | 98.415 | 113.616 |
| 12/11/15 | 98.408 | 112.053 |
| 12/14/15 | 97.875 | 110.398 |
| 12/15/15 | 97.724 | 111.331 |
| 12/16/15 | 97.692 | 111.756 |
| 12/17/15 | 97.923 | 111.719 |
| 12/18/15 | 98.016 | 110.876 |
| 12/21/15 | 98.036 | 110.761 |
| 12/22/15 | 97.906 | 111.06 |
| 12/23/15 | 97.884 | 111.633 |
| 12/24/15 | 97.951 | 111.817 |
| 12/28/15 | 98.048 | 111.751 |
| 12/29/15 | 97.858 | 112.132 |
| 12/30/15 | 97.834 | 112.194 |
| 12/31/15 | 97.954 | 112.164 |
| 1/4/16 | 97.954 | 111.61 |
| 1/5/16 | 97.883 | 112.157 |
| 1/6/16 | 98.075 | 112.146 |
| 1/7/16 | 98.019 | 111.674 |
| 1/8/16 | 98.141 | 111.833 |
| 1/11/16 | 97.966 | 111.469 |
| 1/12/16 | 97.968 | 111.045 |
| 1/13/16 | 97.973 | 110.498 |
| 1/14/16 | 97.726 | 109.605 |
| 1/15/16 | 97.656 | 108.22 |
| 1/19/16 | 97.422 | 106.701 |
| 1/20/16 | 97.151 | 104.751 |
| 1/21/16 | 97.215 | 105.29 |
| 1/22/16 | 97.163 | 106.657 |
| 1/25/16 | 97.159 | 106.911 |
| 1/26/16 | 97.197 | 107.204 |
| 1/27/16 | 97.048 | 107.442 |
| 1/28/16 | 97.129 | 107.959 |
| 1/29/16 | 97.357 | 108.363 |
| 2/1/16 | 97.19 | 108.18 |
| 2/2/16 | 97.337 | 107.497 |
| 2/3/16 | 97.327 | 107.249 |
| 2/4/16 | 97.387 | 107.393 |
| 2/5/16 | 97.392 | 106.952 |
| 2/8/16 | 97.497 | 105.276 |
| 2/9/16 | 97.38 | 104.63 |
| 2/10/16 | 97.494 | 105 |
| 2/11/16 | 97.536 | 103.609 |
| 2/12/16 | 97.221 | 104.265 |
| 2/16/16 | 96.823 | 105.687 |
| 2/17/16 | 96.752 | 106.697 |
| 2/18/16 | 97.125 | 107.321 |
| 2/19/16 | 97.184 | 107.105 |
| 2/22/16 | 97.277 | 107.702 |
| 2/23/16 | 97.403 | 107.614 |
| 2/24/16 | 97.493 | 107.304 |
| 2/25/16 | 97.671 | 107.935 |
| 2/26/16 | 97.635 | 108.879 |
| 2/29/16 | 97.849 | 109.804 |
| 3/1/16 | 97.704 | 110.942 |
| 3/2/16 | 97.698 | 111.706 |
| 3/3/16 | 97.916 | 112.167 |
| 3/4/16 | 97.913 | 113.082 |
| 3/7/16 | 98.053 | 113.458 |
| 3/8/16 | 98.473 | 112.986 |
| 3/9/16 | 98.318 | 112.846 |
| 3/10/16 | 98.368 | 113.184 |
| 3/11/16 | 98.541 | 114.211 |
| 3/14/16 | 98.884 | 114.51 |
| 3/15/16 | 98.904 | 114.043 |
| 3/16/16 | 98.905 | 113.864 |
| 3/17/16 | 99.356 | 114.716 |
| 3/18/16 | 99.586 | 115.523 |
| 3/21/16 | 99.581 | 115.663 |
| 3/22/16 | 99.59 | 115.435 |
| 3/23/16 | 99.727 | 115.115 |
| 3/24/16 | 99.659 | 114.191 |
| 3/28/16 | 99.666 | 113.974 |
| 3/29/16 | 99.821 | 113.52 |
| 3/30/16 | 99.914 | 114.159 |
| 3/31/16 | 100.16 | 114.42 |
| 4/1/16 | 100.239 | 114.414 |
| 4/4/16 | 100.344 | 114.445 |
| 4/5/16 | 100.51 | 113.977 |
| 4/6/16 | 100.402 | 114.326 |
| 4/7/16 | 100.595 | 114.184 |
| 4/8/16 | 100.553 | 114.388 |
| 4/11/16 | 100.536 | 114.726 |
| 4/12/16 | 100.422 | 115.276 |
| 4/13/16 | 100.523 | 116.313 |
| 4/14/16 | 100.553 | 116.732 |
| 4/15/16 | 100.795 | 116.767 |
| 4/18/16 | 100.717 | 116.694 |
| 4/19/16 | 100.914 | 117.525 |
| 4/20/16 | 100.969 | 118.048 |
| 4/21/16 | 100.831 | 118.202 |
| 4/22/16 | 100.819 | 118.149 |
| 4/25/16 | 100.752 | 117.862 |
| 4/26/16 | 100.613 | 118.006 |
| 4/27/16 | 100.75 | 118.405 |
| 4/28/16 | 100.971 | 118.933 |
| 4/29/16 | 101.057 | 118.977 |
| 5/2/16 | 100.972 | 118.989 |
| 5/3/16 | 101.105 | 118.358 |
| 5/4/16 | 100.988 | 118 |
| 5/5/16 | 101.081 | 117.869 |
| 5/6/16 | 100.977 | 117.444 |
| 5/9/16 | 100.928 | 117.376 |
| 5/10/16 | 100.974 | 117.498 |
| 5/11/16 | 101.032 | 117.891 |
| 5/12/16 | 100.877 | 118.018 |
| 5/13/16 | 100.95 | 117.876 |
| 5/16/16 | 100.827 | 118.086 |
| 5/17/16 | 100.809 | 118.204 |
| 5/18/16 | 100.373 | 118.032 |
| 5/19/16 | 100.166 | 117.415 |
| 5/20/16 | 100.176 | 117.792 |
| 5/23/16 | 100.188 | 117.807 |
| 5/24/16 | 100.101 | 117.977 |
| 5/25/16 | 100.192 | 118.409 |
| 5/26/16 | 100.45 | 118.541 |
| 5/27/16 | 100.506 | 118.585 |
| 5/31/16 | 100.47 | 118.559 |
| 6/1/16 | 100.493 | 118.352 |
| 6/2/16 | 100.662 | 118.563 |
| 6/3/16 | 101.087 | 118.704 |
| 6/6/16 | 101.088 | 119.22 |
| 6/7/16 | 101.226 | 119.692 |
| 6/8/16 | 101.365 | 120.306 |
| 6/9/16 | 101.487 | 120.209 |
| 6/10/16 | 101.496 | 119.766 |
| 6/13/16 | 101.487 | 119.446 |
| 6/14/16 | 101.329 | 118.664 |
| 6/15/16 | 101.419 | 118.829 |
| 6/16/16 | 101.489 | 118.23 |
| 6/17/16 | 101.401 | 118.77 |
| 6/20/16 | 101.327 | 119.641 |
| 6/21/16 | 101.29 | 119.573 |
| 6/22/16 | 101.359 | 119.983 |
| 6/23/16 | 101.335 | 120.37 |
| 6/24/16 | 101.522 | 119.364 |
| 6/27/16 | 101.852 | 118.321 |
| 6/28/16 | 102.038 | 118.764 |
| 6/29/16 | 102.242 | 119.679 |
| 6/30/16 | 102.263 | 120.071 |
| 7/1/16 | 102.602 | 120.728 |
| 7/5/16 | 103.03 | 120.715 |
| 7/6/16 | 103.096 | 120.597 |
| 7/7/16 | 103.202 | 121.055 |
| 7/8/16 | 103.443 | 121.566 |
| 7/11/16 | 103.472 | 122.378 |
| 7/12/16 | 103.204 | 123.104 |
| 7/13/16 | 103.367 | 122.802 |
| 7/14/16 | 103.127 | 123.13 |
| 7/15/16 | 102.886 | 123.011 |
| 7/18/16 | 102.841 | 122.979 |
| 7/19/16 | 102.936 | 122.968 |
| 7/20/16 | 102.851 | 123.102 |
| 7/21/16 | 102.9 | 123.186 |
| 7/22/16 | 102.963 | 123.151 |
| 7/25/16 | 102.905 | 123.163 |
| 7/26/16 | 102.742 | 122.864 |
| 7/27/16 | 102.84 | 122.804 |
| 7/28/16 | 102.876 | 122.636 |
| 7/29/16 | 103.038 | 122.399 |
| 8/1/16 | 102.887 | 122.327 |
| 8/2/16 | 102.539 | 121.987 |
| 8/3/16 | 102.504 | 122.144 |
| 8/4/16 | 102.848 | 122.718 |
| 8/5/16 | 102.692 | 123.146 |
| 8/8/16 | 102.723 | 123.464 |
| 8/9/16 | 102.899 | 123.896 |
| 8/10/16 | 103.176 | 123.947 |
| 8/11/16 | 103.017 | 123.908 |
| 8/12/16 | 103.238 | 124.104 |
| 8/15/16 | 103.08 | 124.345 |
| 8/16/16 | 103.077 | 124.48 |
| 8/17/16 | 103.089 | 124.378 |
| 8/18/16 | 103.264 | 124.419 |
| 8/19/16 | 103.14 | 124.527 |
| 8/22/16 | 103.33 | 124.449 |
| 8/23/16 | 103.408 | 124.567 |
| 8/24/16 | 103.36 | 124.527 |
| 8/25/16 | 103.219 | 124.364 |
| 8/26/16 | 103.182 | 124.463 |
| 8/29/16 | 103.212 | 124.508 |
| 8/30/16 | 103.254 | 124.565 |
| 8/31/16 | 103.204 | 124.444 |
| 9/1/16 | 103.106 | 124.275 |
| 9/2/16 | 103.02 | 124.482 |
| 9/6/16 | 103.173 | 124.57 |
| 9/7/16 | 103.214 | 124.769 |
| 9/8/16 | 102.844 | 124.765 |
| 9/9/16 | 102.316 | 124.169 |
| 9/12/16 | 102.142 | 123.817 |
| 9/13/16 | 101.89 | 123.406 |
| 9/14/16 | 101.934 | 123.322 |
| 9/15/16 | 101.875 | 123.342 |
| 9/16/16 | 101.964 | 123.323 |
| 9/19/16 | 101.972 | 123.381 |
| 9/20/16 | 102.086 | 123.37 |
| 9/21/16 | 102.085 | 123.718 |
| 9/22/16 | 102.565 | 124.528 |
| 9/23/16 | 102.627 | 124.463 |
| 9/26/16 | 102.662 | 124.311 |
| 9/27/16 | 102.729 | 124.202 |
| 9/28/16 | 102.795 | 124.501 |
| 9/29/16 | 102.757 | 124.732 |
| 9/30/16 | 102.664 | 124.902 |
| 10/3/16 | 102.561 | 124.974 |
| 10/4/16 | 102.348 | 125.042 |
| 10/5/16 | 102.133 | 125.154 |
| 10/6/16 | 102.123 | 125.243 |
| 10/7/16 | 102.143 | 125.303 |
| 10/10/16 | 102.15 | 125.35 |
| 10/11/16 | 102.031 | 125.271 |
| 10/12/16 | 101.979 | 125.249 |
| 10/13/16 | 102.181 | 125.06 |
| 10/14/16 | 102.049 | 125.313 |
| 10/17/16 | 102.116 | 125.403 |
| 10/18/16 | 102.243 | 125.59 |
| 10/19/16 | 102.331 | 125.904 |
| 10/20/16 | 102.341 | 126.012 |
| 10/21/16 | 102.286 | 126.004 |
| 10/24/16 | 102.156 | 126.084 |
| 10/25/16 | 102.106 | 126.031 |
| 10/26/16 | 101.852 | 125.645 |
| 10/27/16 | 101.515 | 125.294 |
| 10/28/16 | 101.435 | 125.038 |
| 10/31/16 | 101.431 | 124.615 |
| 11/1/16 | 101.273 | 123.926 |
| 11/2/16 | 101.354 | 123.269 |
| 11/3/16 | 101.293 | 123.356 |
| 11/4/16 | 101.395 | 123.256 |
| 11/7/16 | 101.386 | 123.972 |
| 11/8/16 | 101.271 | 124.022 |
| 11/9/16 | 100.589 | 123.549 |
| 11/10/16 | 100.282 | 122.922 |
| 11/11/16 | 100.288 | 122.849 |
| 11/14/16 | 99.481 | 121.393 |
| 11/15/16 | 99.542 | 122.154 |
| 11/16/16 | 99.526 | 122.299 |
| 11/17/16 | 99.292 | 122.572 |
| 11/18/16 | 98.92 | 122.404 |
| 11/21/16 | 98.856 | 122.543 |
| 11/22/16 | 98.95 | 122.907 |
| 11/23/16 | 98.65 | 122.942 |
| 11/25/16 | 98.709 | 122.939 |
| 11/28/16 | 98.919 | 123.06 |
| 11/29/16 | 98.971 | 122.942 |
| 11/30/16 | 98.83 | 123.153 |
| 12/1/16 | 98.527 | 123.047 |
| 12/2/16 | 98.798 | 123.085 |
| 12/5/16 | 98.825 | 123.35 |
| 12/6/16 | 98.837 | 123.66 |
| 12/7/16 | 99.082 | 124.346 |
| 12/8/16 | 98.897 | 124.442 |
| 12/9/16 | 98.652 | 124.634 |
| 12/12/16 | 98.532 | 124.706 |
| 12/13/16 | 98.641 | 124.826 |
| 12/14/16 | 98.708 | 124.841 |
| 12/15/16 | 98.218 | 124.209 |
| 12/16/16 | 98.231 | 124.196 |
| 12/19/16 | 98.398 | 124.25 |
| 12/20/16 | 98.342 | 124.323 |
| 12/21/16 | 98.52 | 124.401 |
| 12/22/16 | 98.526 | 124.557 |
| 12/23/16 | 98.608 | 124.7 |
| 12/27/16 | 98.599 | 124.757 |
| 12/28/16 | 98.772 | 124.979 |
| 12/29/16 | 99.053 | 125.079 |
| 12/30/16 | 99.166 | 125.024 |